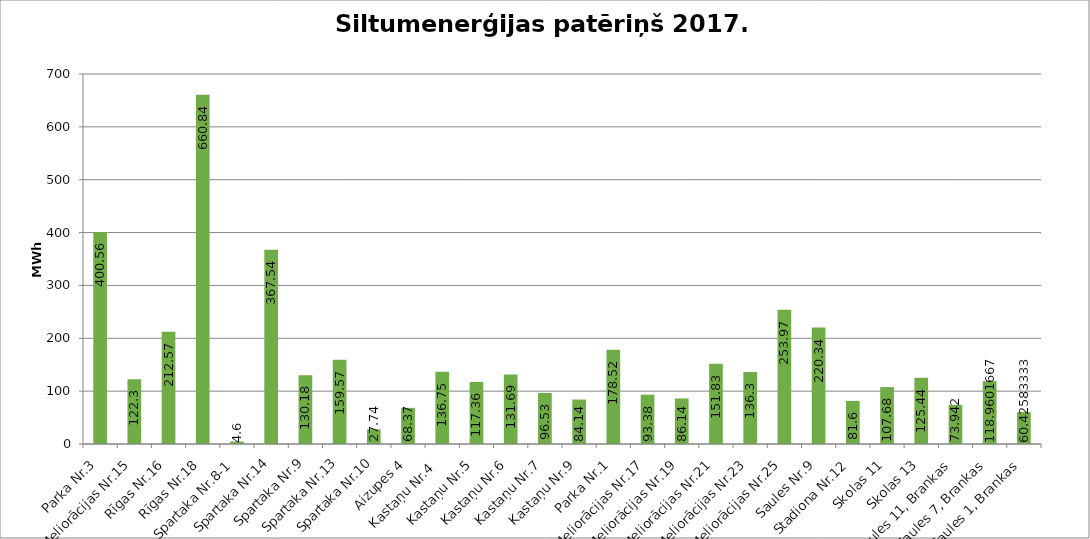
| Category | Series 0 |
|---|---|
| Parka Nr.3 | 400.56 |
| Meliorācijas Nr.15 | 122.3 |
| Rīgas Nr.16 | 212.57 |
| Rīgas Nr.18 | 660.84 |
| Spartaka Nr.8-1 | 4.6 |
| Spartaka Nr.14 | 367.54 |
| Spartaka Nr.9 | 130.18 |
| Spartaka Nr.13 | 159.57 |
| Spartaka Nr.10 | 27.74 |
| Aizupes 4 | 68.37 |
| Kastaņu Nr.4  | 136.75 |
| Kastaņu Nr.5 | 117.36 |
| Kastaņu Nr.6 | 131.69 |
| Kastaņu Nr.7 | 96.53 |
| Kastaņu Nr.9 | 84.14 |
| Parka Nr.1 | 178.52 |
| Meliorācijas Nr.17 | 93.38 |
| Meliorācijas Nr.19 | 86.14 |
| Meliorācijas Nr.21 | 151.83 |
| Meliorācijas Nr.23 | 136.3 |
| Meliorācijas Nr.25 | 253.97 |
| Saules Nr.9 | 220.34 |
| Stadiona Nr.12 | 81.6 |
| Skolas 11 | 107.68 |
| Skolas 13 | 125.44 |
| Saules 11, Brankas | 73.942 |
| Saules 7, Brankas | 118.96 |
| Saules 1, Brankas | 60.426 |